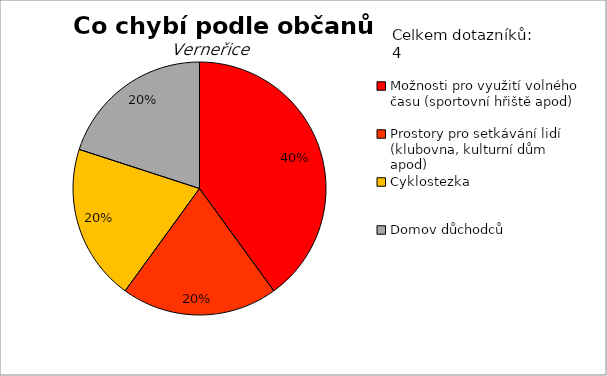
| Category | Series 0 |
|---|---|
| Možnosti pro využití volného času (sportovní hřiště apod) | 2 |
| Prostory pro setkávání lidí (klubovna, kulturní dům apod) | 1 |
| Cyklostezka | 1 |
| Domov důchodců | 1 |